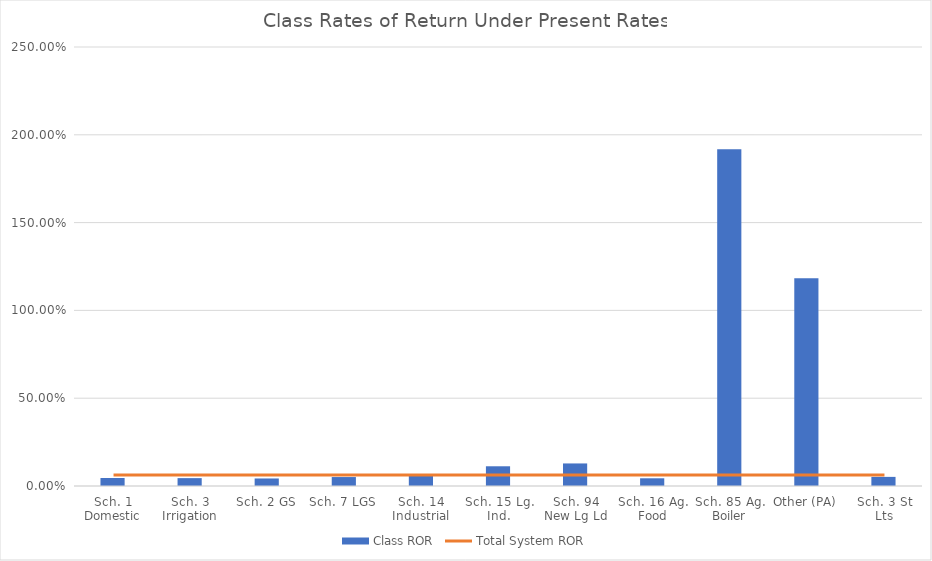
| Category | Class ROR |
|---|---|
| Sch. 1 Domestic | 0.045 |
| Sch. 3 Irrigation | 0.045 |
| Sch. 2 GS | 0.043 |
| Sch. 7 LGS | 0.051 |
| Sch. 14 Industrial | 0.06 |
| Sch. 15 Lg. Ind. | 0.112 |
| Sch. 94 New Lg Ld | 0.128 |
| Sch. 16 Ag. Food | 0.044 |
| Sch. 85 Ag. Boiler | 1.918 |
| Other (PA) | 1.183 |
| Sch. 3 St Lts | 0.052 |